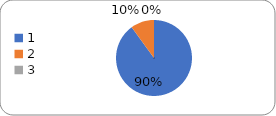
| Category | Series 0 |
|---|---|
| 0 | 81 |
| 1 | 9 |
| 2 | 0 |